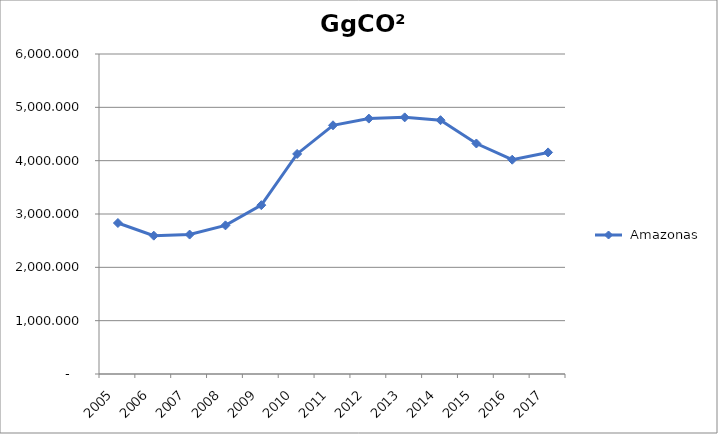
| Category |  Amazonas |
|---|---|
| 2005.0 | 2831.087 |
| 2006.0 | 2593.713 |
| 2007.0 | 2614.358 |
| 2008.0 | 2786.932 |
| 2009.0 | 3165.768 |
| 2010.0 | 4125.918 |
| 2011.0 | 4663.276 |
| 2012.0 | 4788.853 |
| 2013.0 | 4811.954 |
| 2014.0 | 4758.766 |
| 2015.0 | 4321.921 |
| 2016.0 | 4017.997 |
| 2017.0 | 4154.64 |